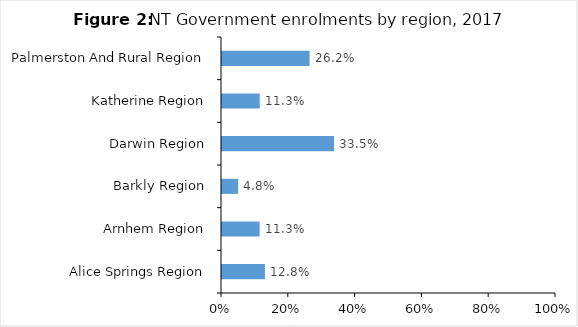
| Category | Series 0 |
|---|---|
| Alice Springs Region | 0.128 |
| Arnhem Region | 0.113 |
| Barkly Region | 0.048 |
| Darwin Region | 0.335 |
| Katherine Region | 0.113 |
| Palmerston And Rural Region | 0.262 |